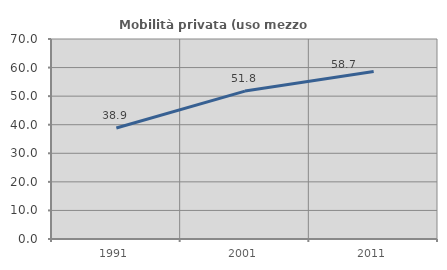
| Category | Mobilità privata (uso mezzo privato) |
|---|---|
| 1991.0 | 38.861 |
| 2001.0 | 51.768 |
| 2011.0 | 58.651 |